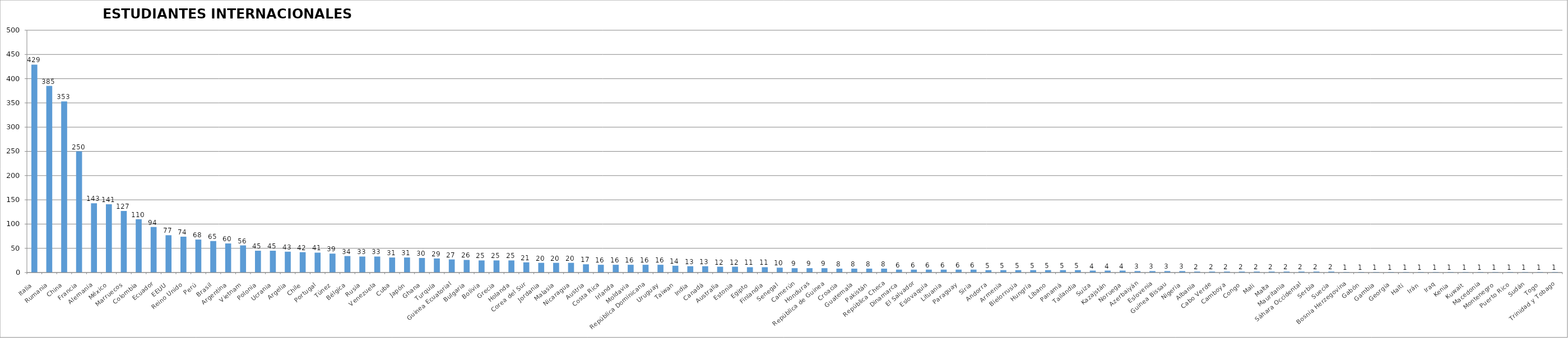
| Category | ESTUDIANTES INTERNACIONALES UNIZAR |
|---|---|
| Italia | 429 |
| Rumania | 385 |
| China | 353 |
| Francia | 250 |
| Alemania | 143 |
| México | 141 |
| Marruecos | 127 |
| Colombia | 110 |
| Ecuador | 94 |
| EEUU | 77 |
| Reino Unido | 74 |
| Perú | 68 |
| Brasil | 65 |
| Argentina | 60 |
| Vietnam | 56 |
| Polonia | 45 |
| Ucrania | 45 |
| Argelia | 43 |
| Chile | 42 |
| Portugal | 41 |
| Túnez | 39 |
| Bélgica | 34 |
| Rusia | 33 |
| Venezuela | 33 |
| Cuba | 31 |
| Japón | 31 |
| Ghana | 30 |
| Turquía | 29 |
| Guinea Ecuatorial | 27 |
| Bulgaria | 26 |
| Bolivia | 25 |
| Grecia | 25 |
| Holanda | 25 |
| Corea del Sur | 21 |
| Jordania | 20 |
| Malasia | 20 |
| Nicaragua | 20 |
| Austria | 17 |
| Costa Rica | 16 |
| Irlanda | 16 |
| Moldavia | 16 |
| República Dominicana | 16 |
| Uruguay | 16 |
| Taiwan | 14 |
| India | 13 |
| Canadá | 13 |
| Australia | 12 |
| Estonia | 12 |
| Egipto | 11 |
| Finlandia | 11 |
| Senegal | 10 |
| Camerún | 9 |
| Honduras | 9 |
| República de Guinea | 9 |
| Croacia | 8 |
| Guatemala | 8 |
| Pakistán | 8 |
| República Checa | 8 |
| Dinamarca | 6 |
| El Salvador | 6 |
| Eslovaquia | 6 |
| Lituania | 6 |
| Paraguay | 6 |
| Siria | 6 |
| Andorra | 5 |
| Armenia | 5 |
| Bielorrusia | 5 |
| Hungría | 5 |
| Líbano | 5 |
| Panamá | 5 |
| Tailandia | 5 |
| Suiza | 4 |
| Kazajstán | 4 |
| Noruega | 4 |
| Azerbaiyán | 3 |
| Eslovenia | 3 |
| Guinea Bissau | 3 |
| Nigeria | 3 |
| Albania | 2 |
| Cabo Verde | 2 |
| Camboya | 2 |
| Congo | 2 |
| Mali | 2 |
| Malta | 2 |
| Mauritania | 2 |
| Sáhara Occidental | 2 |
| Serbia | 2 |
| Suecia | 2 |
| Bosnia Herzegovina | 1 |
| Gabón | 1 |
| Gambia | 1 |
| Georgia | 1 |
| Haití | 1 |
| Irán | 1 |
| Iraq | 1 |
| Kenia | 1 |
| Kuwait | 1 |
| Macedonia | 1 |
| Montenegro | 1 |
| Puerto Rico | 1 |
| Sudán | 1 |
| Togo | 1 |
| Trinidad y Tobago | 1 |